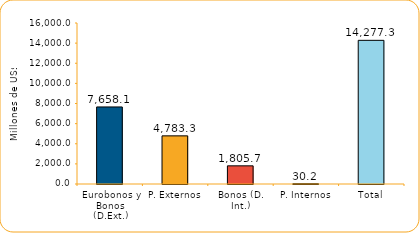
| Category | Series 1 |
|---|---|
| Eurobonos y Bonos (D.Ext.) | 7658.1 |
| P. Externos | 4783.3 |
| Bonos (D. Int.) | 1805.7 |
| P. Internos | 30.2 |
| Total | 14277.3 |